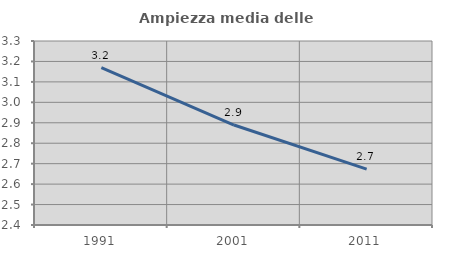
| Category | Ampiezza media delle famiglie |
|---|---|
| 1991.0 | 3.17 |
| 2001.0 | 2.889 |
| 2011.0 | 2.674 |